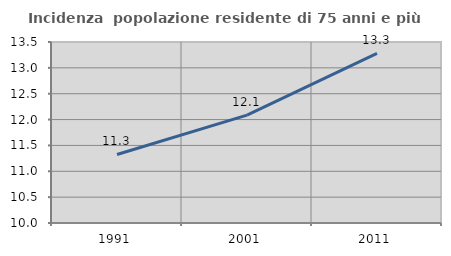
| Category | Incidenza  popolazione residente di 75 anni e più |
|---|---|
| 1991.0 | 11.325 |
| 2001.0 | 12.087 |
| 2011.0 | 13.278 |